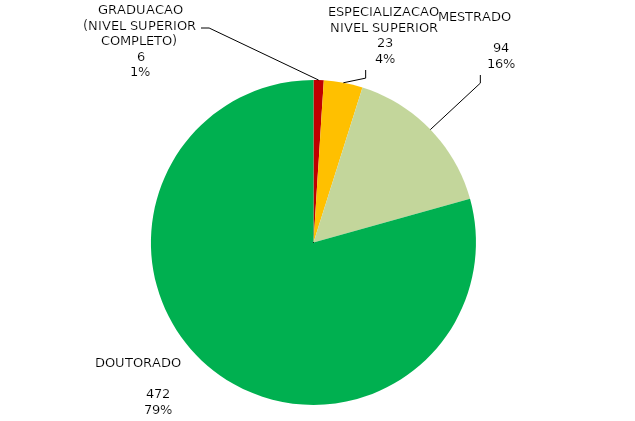
| Category | Total Geral |
|---|---|
| GRADUACAO (NIVEL SUPERIOR COMPLETO) | 6 |
| ESPECIALIZACAO NIVEL SUPERIOR | 23 |
| MESTRADO                              | 94 |
| DOUTORADO                             | 472 |